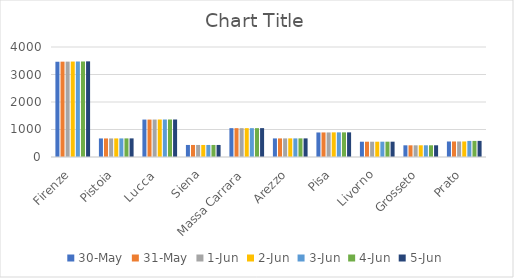
| Category | 30-mag | 31-mag | 01-giu | 02-giu | 03-giu | 04-giu | 05-giu |
|---|---|---|---|---|---|---|---|
| Firenze | 3464 | 3467 | 3468 | 3471 | 3473 | 3473 | 3478 |
| Pistoia | 675 | 675 | 675 | 676 | 676 | 677 | 677 |
| Lucca  | 1361 | 1361 | 1362 | 1363 | 1364 | 1364 | 1364 |
| Siena | 438 | 438 | 438 | 438 | 438 | 438 | 438 |
| Massa Carrara | 1049 | 1049 | 1049 | 1049 | 1049 | 1049 | 1050 |
| Arezzo | 676 | 676 | 677 | 677 | 677 | 677 | 677 |
| Pisa | 892 | 893 | 893 | 896 | 896 | 896 | 896 |
| Livorno | 556 | 556 | 556 | 556 | 557 | 557 | 557 |
| Grosseto | 425 | 425 | 425 | 426 | 426 | 426 | 426 |
| Prato | 564 | 564 | 564 | 565 | 585 | 585 | 586 |